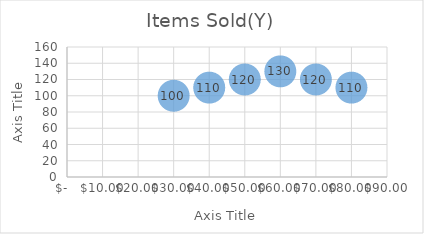
| Category | Items Sold(Y) |
|---|---|
| 30.0 | 100 |
| 40.0 | 110 |
| 50.0 | 120 |
| 60.0 | 130 |
| 70.0 | 120 |
| 80.0 | 110 |